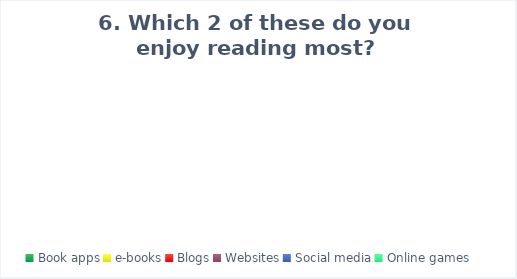
| Category | Series 0 |
|---|---|
| Book apps | 0 |
| e-books | 0 |
| Blogs | 0 |
| Websites | 0 |
| Social media | 0 |
| Online games | 0 |